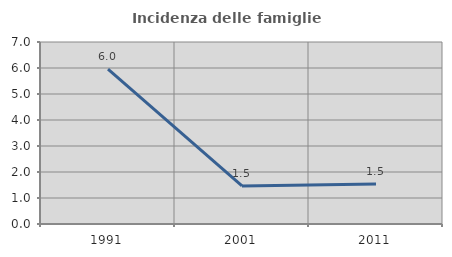
| Category | Incidenza delle famiglie numerose |
|---|---|
| 1991.0 | 5.952 |
| 2001.0 | 1.466 |
| 2011.0 | 1.543 |